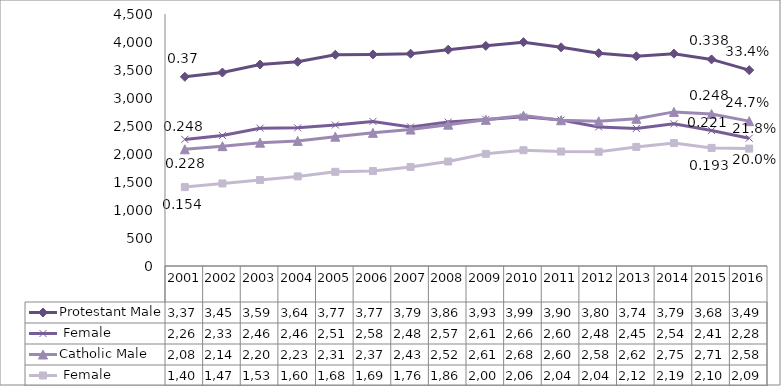
| Category | Protestant | Catholic |
|---|---|---|
| 2001.0 | 2261 | 1409 |
| 2002.0 | 2330 | 1474 |
| 2003.0 | 2461 | 1535 |
| 2004.0 | 2467 | 1600 |
| 2005.0 | 2518 | 1682 |
| 2006.0 | 2582 | 1695 |
| 2007.0 | 2484 | 1769 |
| 2008.0 | 2570 | 1866 |
| 2009.0 | 2618 | 2003 |
| 2010.0 | 2665 | 2068 |
| 2011.0 | 2606 | 2044 |
| 2012.0 | 2483 | 2040 |
| 2013.0 | 2456 | 2126 |
| 2014.0 | 2540 | 2195 |
| 2015.0 | 2419 | 2109 |
| 2016.0 | 2281 | 2096 |